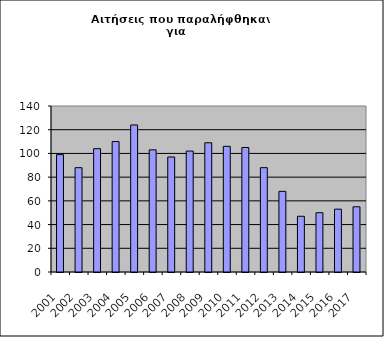
| Category | Series 1 |
|---|---|
| 2001.0 | 99 |
| 2002.0 | 88 |
| 2003.0 | 104 |
| 2004.0 | 110 |
| 2005.0 | 124 |
| 2006.0 | 103 |
| 2007.0 | 97 |
| 2008.0 | 102 |
| 2009.0 | 109 |
| 2010.0 | 106 |
| 2011.0 | 105 |
| 2012.0 | 88 |
| 2013.0 | 68 |
| 2014.0 | 47 |
| 2015.0 | 50 |
| 2016.0 | 53 |
| 2017.0 | 55 |